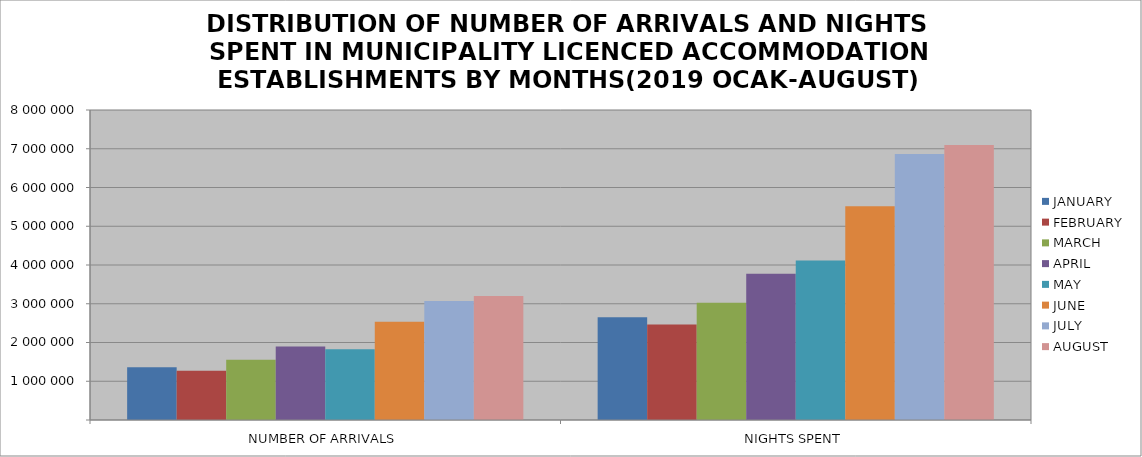
| Category | JANUARY | FEBRUARY | MARCH | APRIL | MAY | JUNE | JULY | AUGUST |
|---|---|---|---|---|---|---|---|---|
| NUMBER OF ARRIVALS | 1363187 | 1273727 | 1552518 | 1898202 | 1826154 | 2537491 | 3073499 | 3201724 |
| NIGHTS SPENT | 2649437 | 2462023 | 3024704 | 3772615 | 4117532 | 5513568 | 6866550 | 7097153 |